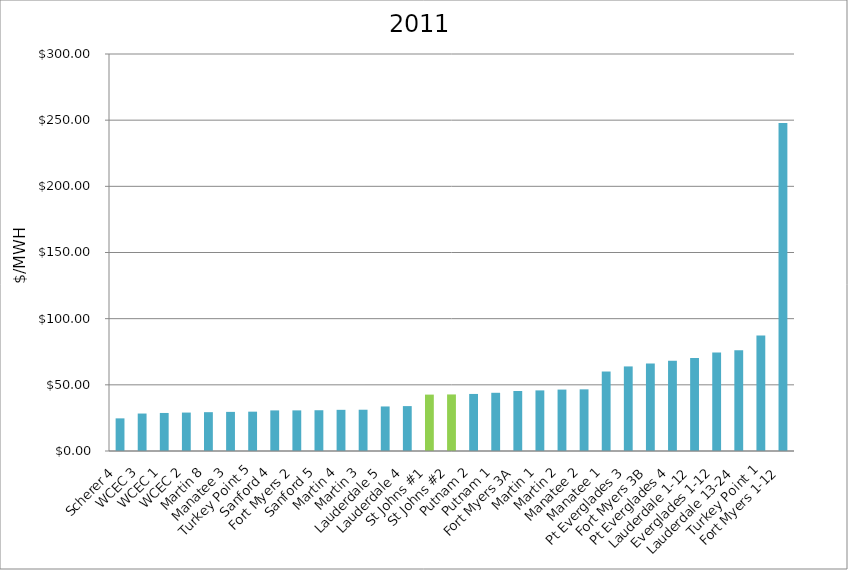
| Category | $/MWH |
|---|---|
| Scherer 4 | 24.663 |
| WCEC 3 | 28.306 |
| WCEC 1 | 28.743 |
| WCEC 2 | 29.042 |
| Martin 8 | 29.342 |
| Manatee 3 | 29.557 |
| Turkey Point 5 | 29.722 |
| Sanford 4 | 30.68 |
| Fort Myers 2 | 30.696 |
| Sanford 5 | 30.808 |
| Martin 4 | 31.111 |
| Martin 3 | 31.189 |
| Lauderdale 5 | 33.659 |
| Lauderdale 4 | 33.928 |
| St Johns #1 | 42.613 |
| St Johns #2 | 42.734 |
| Putnam 2 | 43.109 |
| Putnam 1 | 43.989 |
| Fort Myers 3A | 45.334 |
| Martin 1 | 45.802 |
| Martin 2 | 46.412 |
| Manatee 2 | 46.59 |
| Manatee 1 | 60.065 |
| Pt Everglades 3 | 63.91 |
| Fort Myers 3B | 66.137 |
| Pt Everglades 4 | 68.179 |
| Lauderdale 1-12 | 70.261 |
| Everglades 1-12 | 74.386 |
| Lauderdale 13-24 | 76.042 |
| Turkey Point 1 | 87.279 |
| Fort Myers 1-12 | 247.893 |